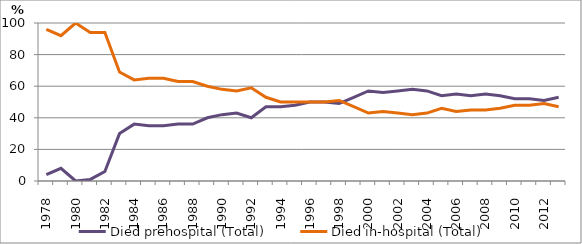
| Category | Died prehospital (Total) | Died in-hospital (Total) |
|---|---|---|
| 1978.0 | 4 | 96 |
| 1979.0 | 8 | 92 |
| 1980.0 | 0 | 100 |
| 1981.0 | 1 | 94 |
| 1982.0 | 6 | 94 |
| 1983.0 | 30 | 69 |
| 1984.0 | 36 | 64 |
| 1985.0 | 35 | 65 |
| 1986.0 | 35 | 65 |
| 1987.0 | 36 | 63 |
| 1988.0 | 36 | 63 |
| 1989.0 | 40 | 60 |
| 1990.0 | 42 | 58 |
| 1991.0 | 43 | 57 |
| 1992.0 | 40 | 59 |
| 1993.0 | 47 | 53 |
| 1994.0 | 47 | 50 |
| 1995.0 | 48 | 50 |
| 1996.0 | 50 | 50 |
| 1997.0 | 50 | 50 |
| 1998.0 | 49 | 51 |
| 1999.0 | 53 | 47 |
| 2000.0 | 57 | 43 |
| 2001.0 | 56 | 44 |
| 2002.0 | 57 | 43 |
| 2003.0 | 58 | 42 |
| 2004.0 | 57 | 43 |
| 2005.0 | 54 | 46 |
| 2006.0 | 55 | 44 |
| 2007.0 | 54 | 45 |
| 2008.0 | 55 | 45 |
| 2009.0 | 54 | 46 |
| 2010.0 | 52 | 48 |
| 2011.0 | 52 | 48 |
| 2012.0 | 51 | 49 |
| 2013.0 | 53 | 47 |